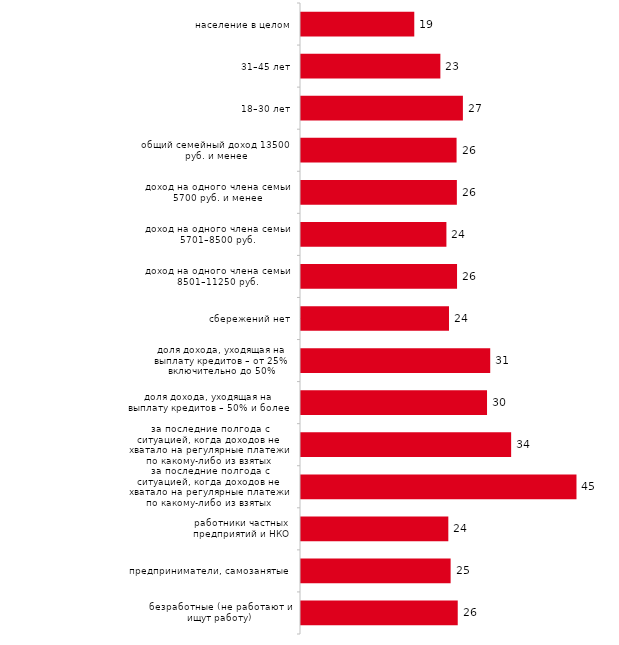
| Category | Занимать деньги в долг у друзей, знакомых |
|---|---|
| население в целом | 18.57 |
| 31–45 лет | 22.847 |
| 18–30 лет | 26.54 |
| общий семейный доход 13500 руб. и менее | 25.503 |
| доход на одного члена семьи 5700 руб. и менее | 25.551 |
| доход на одного члена семьи 5701–8500 руб. | 23.837 |
| доход на одного члена семьи 8501–11250 руб. | 25.581 |
| сбережений нет | 24.261 |
| доля дохода, уходящая на выплату кредитов – от 25% включительно до 50% | 31.02 |
| доля дохода, уходящая на выплату кредитов – 50% и более | 30.496 |
| за последние полгода с ситуацией, когда доходов не хватало на регулярные платежи по какому-либо из взятых кредитов (займов), сталкивались один-два раза | 34.45 |
| за последние полгода с ситуацией, когда доходов не хватало на регулярные платежи по какому-либо из взятых кредитов (займов), сталкивались три раза и чаще | 45.161 |
| работники частных предприятий и НКО | 24.151 |
| предприниматели, самозанятые | 24.528 |
| безработные (не работают и ищут работу) | 25.694 |